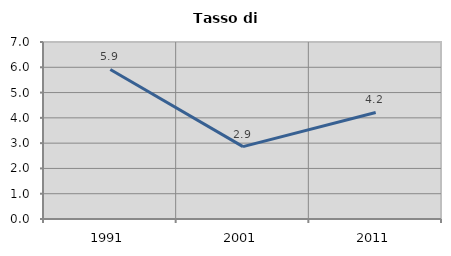
| Category | Tasso di disoccupazione   |
|---|---|
| 1991.0 | 5.914 |
| 2001.0 | 2.863 |
| 2011.0 | 4.213 |